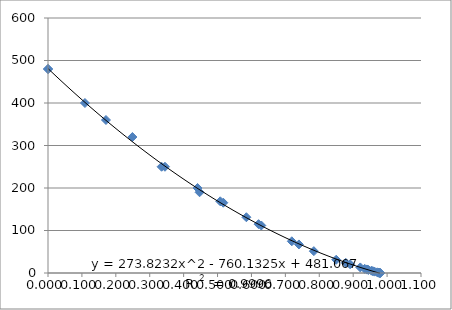
| Category | Series 0 |
|---|---|
| 0.0 | 480 |
| 0.0 | 480 |
| 0.109 | 400 |
| 0.171 | 360 |
| 0.249 | 320 |
| 0.335 | 250 |
| 0.345 | 250 |
| 0.441 | 200 |
| 0.447 | 190 |
| 0.508 | 168.7 |
| 0.517 | 165.4 |
| 0.585 | 131.2 |
| 0.621 | 114.9 |
| 0.629 | 111.8 |
| 0.719 | 74.6 |
| 0.74 | 67.2 |
| 0.784 | 51.4 |
| 0.85 | 31.2 |
| 0.878 | 24 |
| 0.891 | 20.5 |
| 0.921 | 13.1 |
| 0.934 | 9.8 |
| 0.94 | 8.4 |
| 0.941 | 8 |
| 0.945 | 7.2 |
| 0.954 | 5.4 |
| 0.958 | 4.3 |
| 0.963 | 3.2 |
| 0.971 | 1.6 |
| 0.975 | 0.8 |
| 0.975 | 0.9 |
| 0.978 | 0.3 |
| 0.979 | 0 |
| 0.98 | 0 |